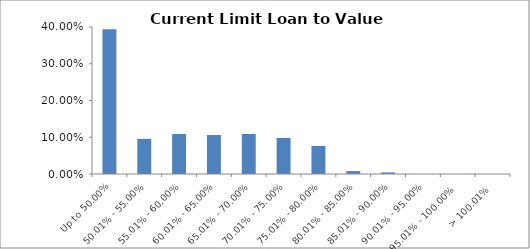
| Category | Series 0 |
|---|---|
| Up to 50.00% | 0.394 |
| 50.01% - 55.00% | 0.096 |
| 55.01% - 60.00% | 0.109 |
| 60.01% - 65.00% | 0.106 |
| 65.01% - 70.00% | 0.109 |
| 70.01% - 75.00% | 0.098 |
| 75.01% - 80.00% | 0.076 |
| 80.01% - 85.00% | 0.008 |
| 85.01% - 90.00% | 0.004 |
| 90.01% - 95.00% | 0 |
| 95.01% - 100.00% | 0 |
| > 100.01% | 0 |